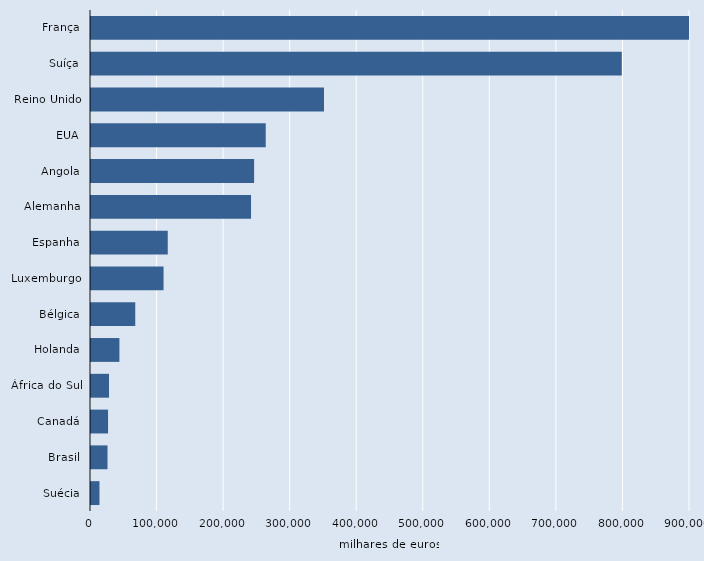
| Category | Series 2 |
|---|---|
| França | 1151040 |
| Suíça | 797490 |
| Reino Unido | 350080 |
| EUA | 262560 |
| Angola | 245080 |
| Alemanha | 240440 |
| Espanha | 115330 |
| Luxemburgo | 109010 |
| Bélgica | 66500 |
| Holanda | 42710 |
| África do Sul | 27030 |
| Canadá | 25610 |
| Brasil | 24820 |
| Suécia | 12730 |